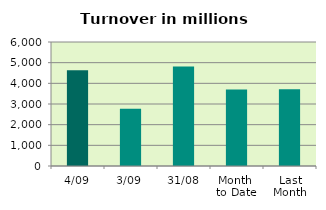
| Category | Series 0 |
|---|---|
| 4/09 | 4634.472 |
| 3/09 | 2774.351 |
| 31/08 | 4809.329 |
| Month 
to Date | 3704.411 |
| Last
Month | 3714.081 |